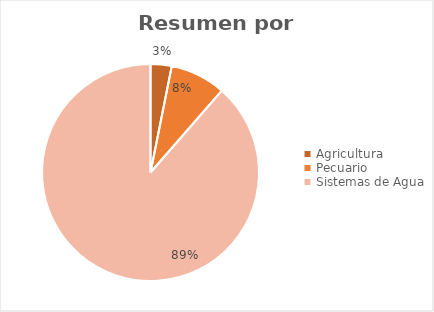
| Category | Series 0 | Series 1 |
|---|---|---|
| Agricultura | 1071479883.61 | 0.031 |
| Pecuario | 2821086086.16 | 0.083 |
| Sistemas de Agua | 30226362429.253 | 0.886 |